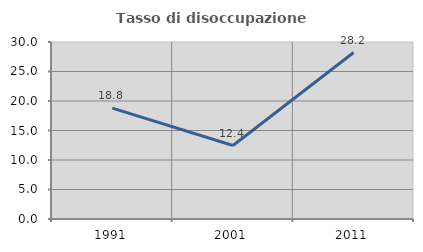
| Category | Tasso di disoccupazione giovanile  |
|---|---|
| 1991.0 | 18.792 |
| 2001.0 | 12.448 |
| 2011.0 | 28.218 |